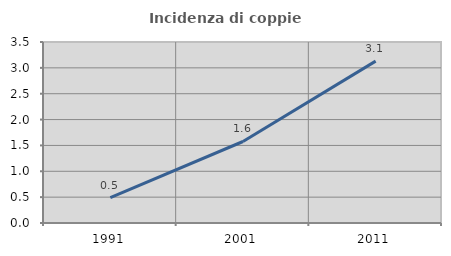
| Category | Incidenza di coppie miste |
|---|---|
| 1991.0 | 0.489 |
| 2001.0 | 1.576 |
| 2011.0 | 3.13 |